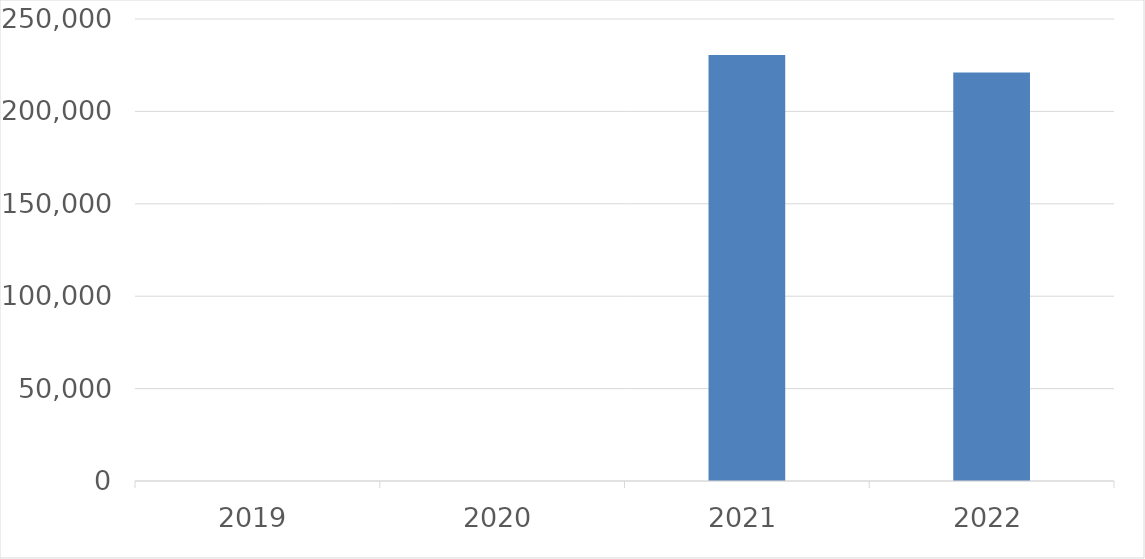
| Category | Series 0 |
|---|---|
| 2019 | 0 |
| 2020 | 0 |
| 2021 | 230580 |
| 2022 | 221012 |